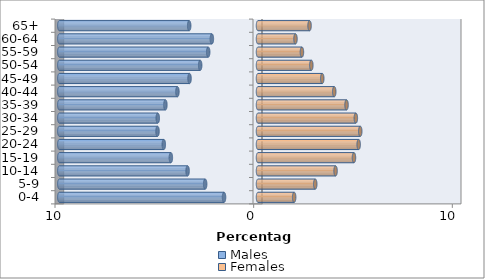
| Category | Males | Females |
|---|---|---|
| 0-4 | -1.71 | 1.82 |
| 5-9 | -2.66 | 2.881 |
| 10-14 | -3.545 | 3.905 |
| 15-19 | -4.387 | 4.831 |
| 20-24 | -4.742 | 5.067 |
| 25-29 | -5.058 | 5.147 |
| 30-34 | -5.046 | 4.925 |
| 35-39 | -4.662 | 4.457 |
| 40-44 | -4.056 | 3.838 |
| 45-49 | -3.447 | 3.234 |
| 50-54 | -2.911 | 2.684 |
| 55-59 | -2.507 | 2.211 |
| 60-64 | -2.322 | 1.887 |
| 65+ | -3.464 | 2.595 |